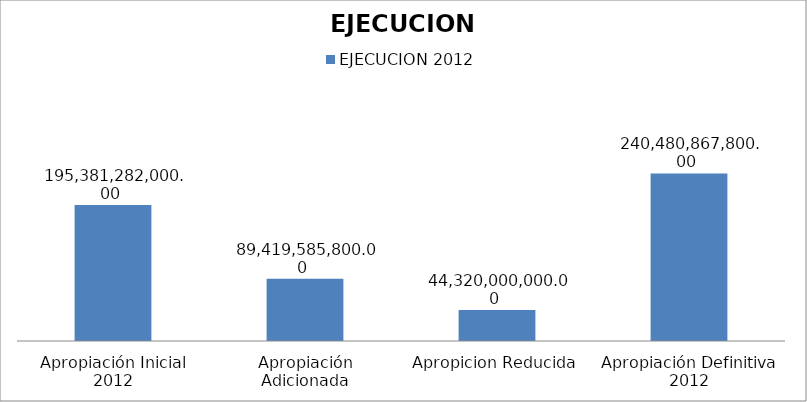
| Category | EJECUCION 2012 |
|---|---|
| Apropiación Inicial 2012 | 195381282000 |
| Apropiación Adicionada | 89419585800 |
| Apropicion Reducida | 44320000000 |
| Apropiación Definitiva 2012 | 240480867800 |